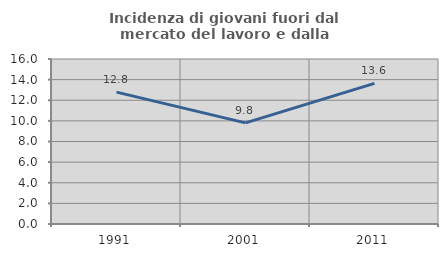
| Category | Incidenza di giovani fuori dal mercato del lavoro e dalla formazione  |
|---|---|
| 1991.0 | 12.791 |
| 2001.0 | 9.804 |
| 2011.0 | 13.636 |